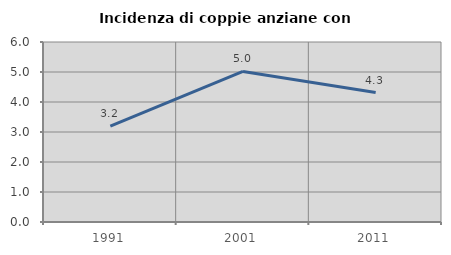
| Category | Incidenza di coppie anziane con figli |
|---|---|
| 1991.0 | 3.195 |
| 2001.0 | 5.019 |
| 2011.0 | 4.315 |